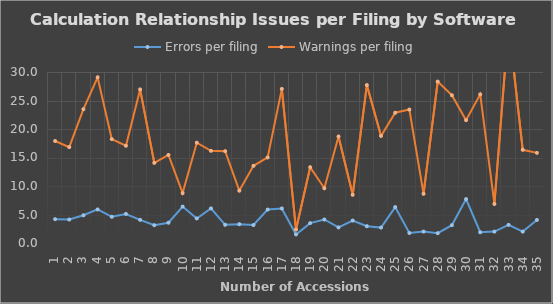
| Category | Errors per filing | Warnings per filing |
|---|---|---|
| 1.0 | 4.185 | 17.892 |
| 2.0 | 4.12 | 16.83 |
| 3.0 | 4.862 | 23.483 |
| 4.0 | 5.887 | 29.058 |
| 5.0 | 4.602 | 18.229 |
| 6.0 | 5.094 | 17.059 |
| 7.0 | 4.064 | 26.949 |
| 8.0 | 3.123 | 14.057 |
| 9.0 | 3.559 | 15.45 |
| 10.0 | 6.389 | 8.746 |
| 11.0 | 4.308 | 17.595 |
| 12.0 | 6.074 | 16.167 |
| 13.0 | 3.19 | 16.111 |
| 14.0 | 3.3 | 9.18 |
| 15.0 | 3.154 | 13.541 |
| 16.0 | 5.864 | 15.008 |
| 17.0 | 6.059 | 27.035 |
| 18.0 | 1.5 | 2.357 |
| 19.0 | 3.486 | 13.289 |
| 20.0 | 4.123 | 9.604 |
| 21.0 | 2.735 | 18.686 |
| 22.0 | 3.94 | 8.449 |
| 23.0 | 2.946 | 27.71 |
| 24.0 | 2.703 | 18.788 |
| 25.0 | 6.303 | 22.852 |
| 26.0 | 1.755 | 23.409 |
| 27.0 | 2 | 8.627 |
| 28.0 | 1.722 | 28.315 |
| 29.0 | 3.13 | 25.924 |
| 30.0 | 7.702 | 21.551 |
| 31.0 | 1.885 | 26.074 |
| 32.0 | 2 | 6.845 |
| 33.0 | 3.182 | 38.425 |
| 34.0 | 2 | 16.347 |
| 35.0 | 4.048 | 15.811 |